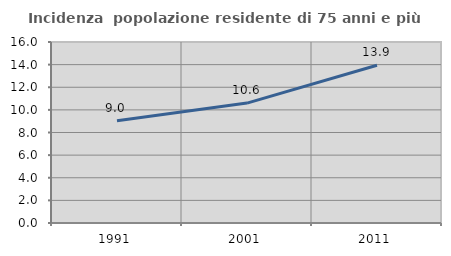
| Category | Incidenza  popolazione residente di 75 anni e più |
|---|---|
| 1991.0 | 9.048 |
| 2001.0 | 10.599 |
| 2011.0 | 13.948 |